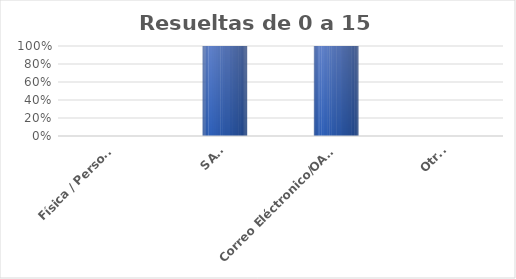
| Category | Series 0 |
|---|---|
| Física / Personal | 0 |
| SAIP | 5 |
| Correo Eléctronico/OAI/Info/Contacto | 12 |
| Otras | 0 |